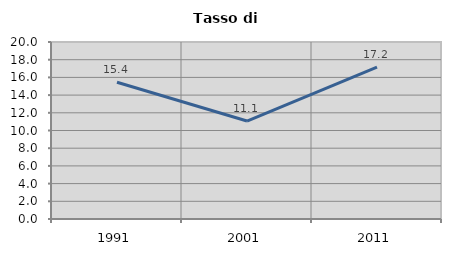
| Category | Tasso di disoccupazione   |
|---|---|
| 1991.0 | 15.446 |
| 2001.0 | 11.067 |
| 2011.0 | 17.168 |